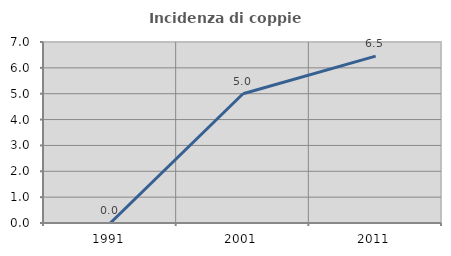
| Category | Incidenza di coppie miste |
|---|---|
| 1991.0 | 0 |
| 2001.0 | 5 |
| 2011.0 | 6.452 |